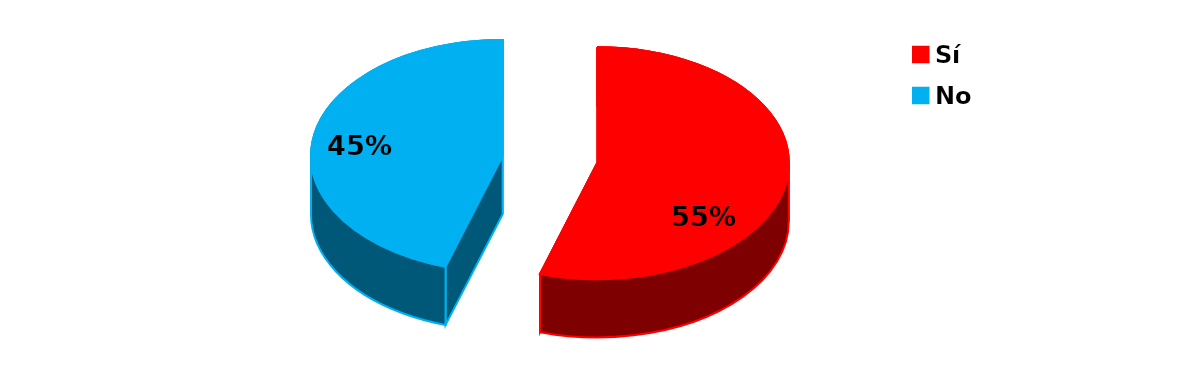
| Category | Series 0 |
|---|---|
| Sí | 279 |
| No | 230 |